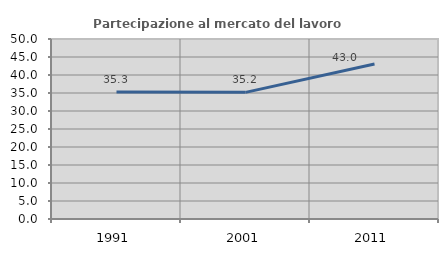
| Category | Partecipazione al mercato del lavoro  femminile |
|---|---|
| 1991.0 | 35.252 |
| 2001.0 | 35.183 |
| 2011.0 | 43.042 |